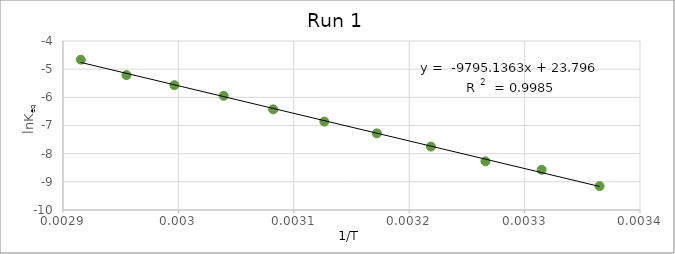
| Category | Series 5 |
|---|---|
| 0.003364963994885255 | -9.153 |
| 0.003314770617873243 | -8.572 |
| 0.0032660526487686982 | -8.272 |
| 0.0032188495831589788 | -7.748 |
| 0.003171985028230667 | -7.279 |
| 0.0031264655307175235 | -6.862 |
| 0.0030821390044691015 | -6.426 |
| 0.0030392365437802026 | -5.947 |
| 0.002996524032122737 | -5.568 |
| 0.002954995419757099 | -5.21 |
| 0.0029154518950437317 | -4.664 |